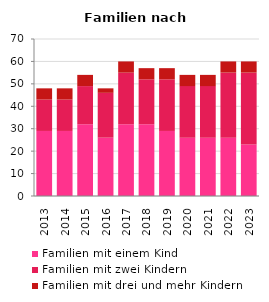
| Category | Familien mit einem Kind | Familien mit zwei Kindern | Familien mit drei und mehr Kindern |
|---|---|---|---|
| 2013.0 | 29 | 14 | 5 |
| 2014.0 | 29 | 14 | 5 |
| 2015.0 | 32 | 17 | 5 |
| 2016.0 | 26 | 20 | 2 |
| 2017.0 | 32 | 23 | 5 |
| 2018.0 | 32 | 20 | 5 |
| 2019.0 | 29 | 23 | 5 |
| 2020.0 | 26 | 23 | 5 |
| 2021.0 | 26 | 23 | 5 |
| 2022.0 | 26 | 29 | 5 |
| 2023.0 | 23 | 32 | 5 |